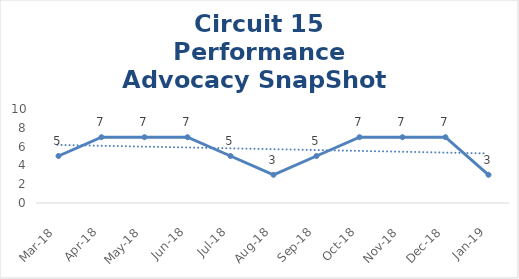
| Category | Circuit 15 |
|---|---|
| Mar-18 | 5 |
| Apr-18 | 7 |
| May-18 | 7 |
| Jun-18 | 7 |
| Jul-18 | 5 |
| Aug-18 | 3 |
| Sep-18 | 5 |
| Oct-18 | 7 |
| Nov-18 | 7 |
| Dec-18 | 7 |
| Jan-19 | 3 |